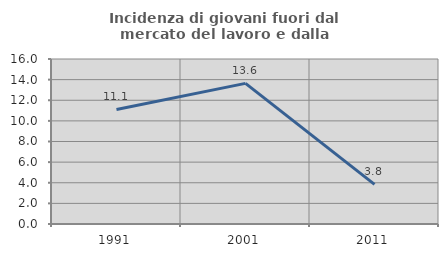
| Category | Incidenza di giovani fuori dal mercato del lavoro e dalla formazione  |
|---|---|
| 1991.0 | 11.111 |
| 2001.0 | 13.636 |
| 2011.0 | 3.846 |